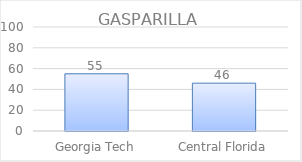
| Category | Series 0 |
|---|---|
| Georgia Tech | 55 |
| Central Florida | 46 |